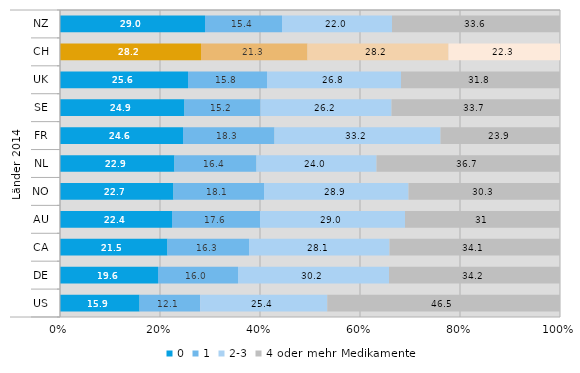
| Category | 0 | 1 | 2-3 | 4 oder mehr Medikamente |
|---|---|---|---|---|
| 0 | 29 | 15.4 | 22 | 33.6 |
| 1 | 28.2 | 21.3 | 28.2 | 22.3 |
| 2 | 25.6 | 15.8 | 26.8 | 31.8 |
| 3 | 24.9 | 15.2 | 26.2 | 33.7 |
| 4 | 24.6 | 18.3 | 33.2 | 23.9 |
| 5 | 22.9 | 16.4 | 24 | 36.7 |
| 6 | 22.7 | 18.1 | 28.9 | 30.3 |
| 7 | 22.4 | 17.6 | 29 | 31 |
| 8 | 21.5 | 16.3 | 28.1 | 34.1 |
| 9 | 19.6 | 16 | 30.2 | 34.2 |
| 10 | 15.9 | 12.1 | 25.4 | 46.5 |